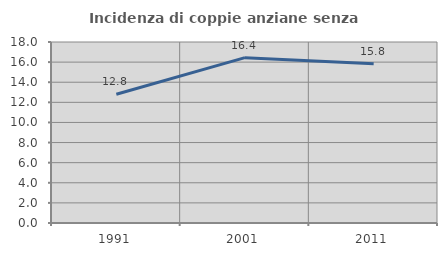
| Category | Incidenza di coppie anziane senza figli  |
|---|---|
| 1991.0 | 12.801 |
| 2001.0 | 16.443 |
| 2011.0 | 15.828 |